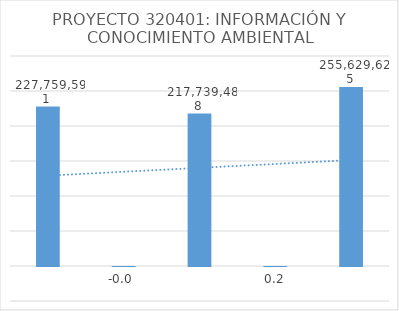
| Category | Series 0 |
|---|---|
| 0 | 227759591 |
| 1 | -0.044 |
| 2 | 217739488 |
| 3 | 0.174 |
| 4 | 255629625.272 |